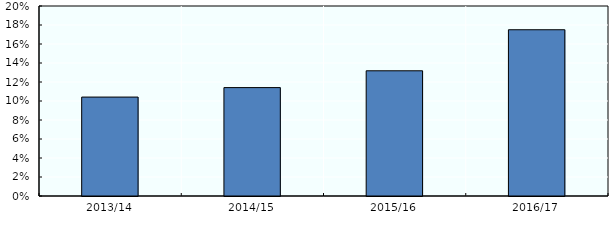
| Category | Series 0 |
|---|---|
| 2013/14 | 0.104 |
| 2014/15 | 0.114 |
| 2015/16 | 0.132 |
| 2016/17 | 0.175 |